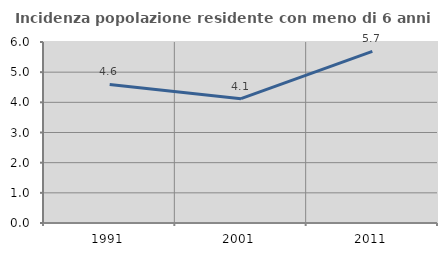
| Category | Incidenza popolazione residente con meno di 6 anni |
|---|---|
| 1991.0 | 4.594 |
| 2001.0 | 4.122 |
| 2011.0 | 5.688 |